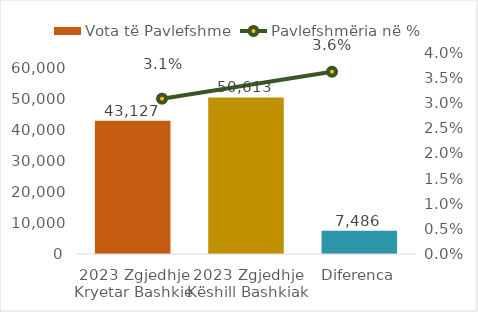
| Category | Vota të Pavlefshme |
|---|---|
| 2023 Zgjedhje Kryetar Bashkie | 43127 |
| 2023 Zgjedhje Këshill Bashkiak | 50613 |
| Diferenca | 7486 |